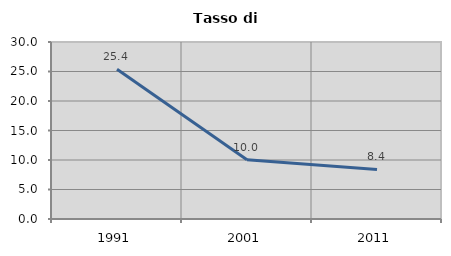
| Category | Tasso di disoccupazione   |
|---|---|
| 1991.0 | 25.388 |
| 2001.0 | 10.046 |
| 2011.0 | 8.403 |